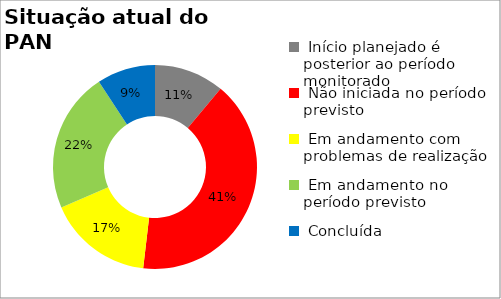
| Category | Series 0 |
|---|---|
|  Início planejado é posterior ao período monitorado | 0.111 |
|  Não iniciada no período previsto | 0.407 |
|  Em andamento com problemas de realização | 0.167 |
|  Em andamento no período previsto  | 0.222 |
|  Concluída | 0.093 |